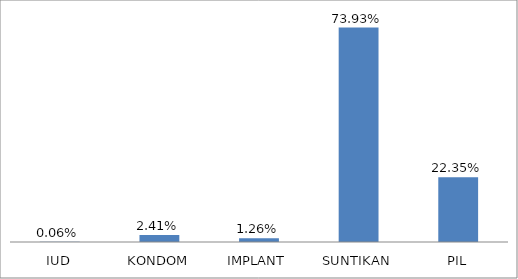
| Category | Series 0 |
|---|---|
| IUD | 0.001 |
| KONDOM | 0.024 |
| IMPLANT | 0.013 |
| SUNTIKAN | 0.739 |
| PIL | 0.224 |